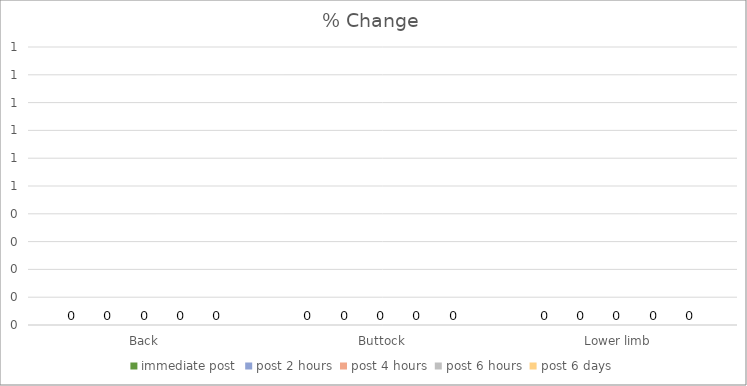
| Category | immediate post | post 2 hours | post 4 hours | post 6 hours | post 6 days |
|---|---|---|---|---|---|
| Back | 0 | 0 | 0 | 0 | 0 |
| Buttock | 0 | 0 | 0 | 0 | 0 |
| Lower limb | 0 | 0 | 0 | 0 | 0 |